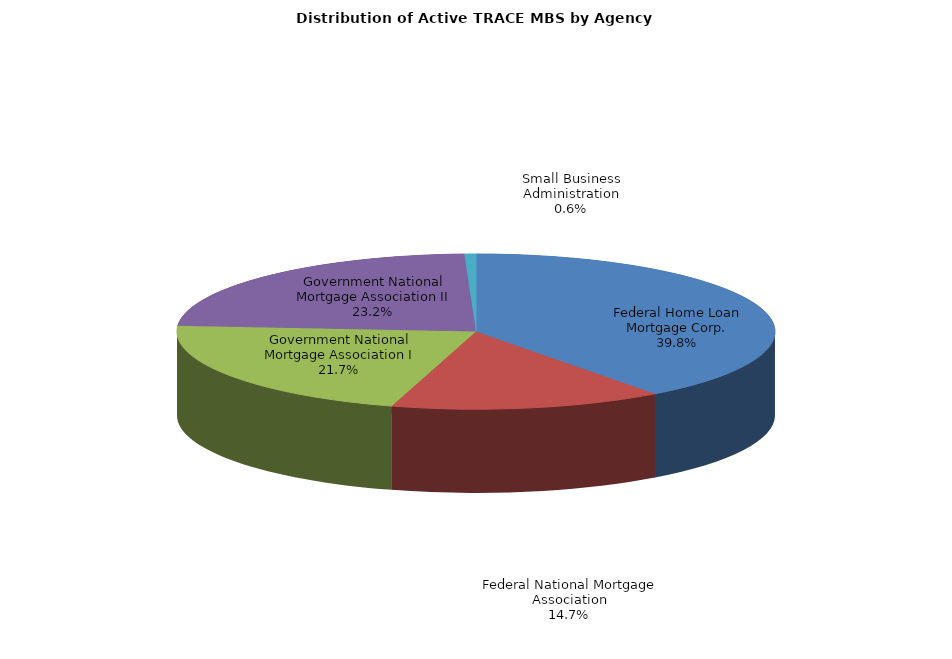
| Category | Series 0 |
|---|---|
| Federal Home Loan Mortgage Corp. | 261564 |
| Federal National Mortgage Association | 96897 |
| Government National Mortgage Association I | 142367 |
| Government National Mortgage Association II | 152319 |
| Small Business Administration | 4088 |